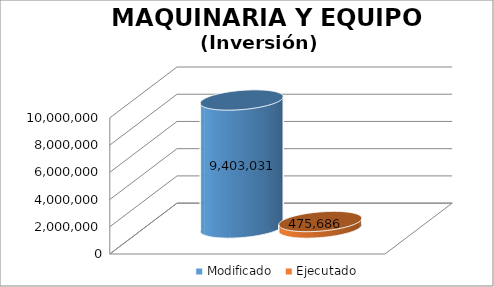
| Category | Modificado | Ejecutado |
|---|---|---|
| 0 | 9403031 | 475686.05 |